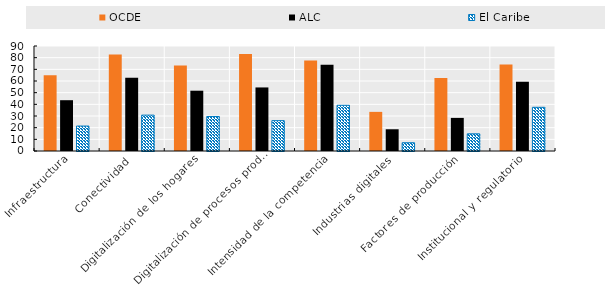
| Category | OCDE | ALC | El Caribe |
|---|---|---|---|
| Infraestructura | 64.85 | 43.54 | 21.4 |
| Conectividad | 82.66 | 62.83 | 30.754 |
| Digitalización de los hogares | 73.36 | 51.68 | 29.559 |
| Digitalización de procesos productivos | 83.05 | 54.48 | 26.03 |
| Intensidad de la competencia | 77.63 | 73.97 | 39.175 |
| Industrias digitales | 33.54 | 18.63 | 7.1 |
| Factores de producción | 62.66 | 28.37 | 14.734 |
| Institucional y regulatorio | 74.25 | 59.38 | 37.456 |